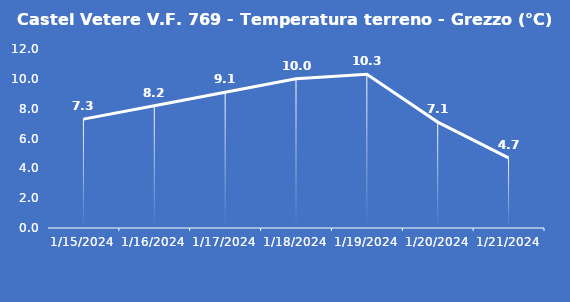
| Category | Castel Vetere V.F. 769 - Temperatura terreno - Grezzo (°C) |
|---|---|
| 1/15/24 | 7.3 |
| 1/16/24 | 8.2 |
| 1/17/24 | 9.1 |
| 1/18/24 | 10 |
| 1/19/24 | 10.3 |
| 1/20/24 | 7.1 |
| 1/21/24 | 4.7 |